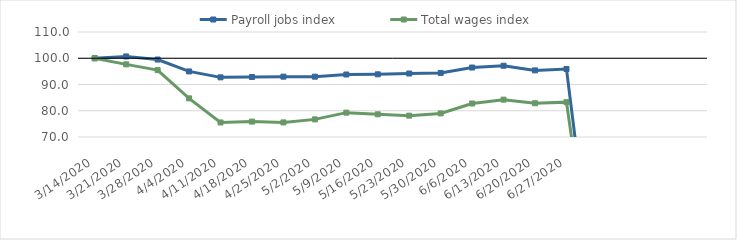
| Category | Payroll jobs index | Total wages index |
|---|---|---|
| 14/03/2020 | 100 | 100 |
| 21/03/2020 | 100.69 | 97.676 |
| 28/03/2020 | 99.508 | 95.471 |
| 04/04/2020 | 94.982 | 84.722 |
| 11/04/2020 | 92.724 | 75.542 |
| 18/04/2020 | 92.862 | 75.873 |
| 25/04/2020 | 92.989 | 75.556 |
| 02/05/2020 | 92.987 | 76.712 |
| 09/05/2020 | 93.813 | 79.275 |
| 16/05/2020 | 93.879 | 78.648 |
| 23/05/2020 | 94.183 | 78.135 |
| 30/05/2020 | 94.403 | 78.994 |
| 06/06/2020 | 96.462 | 82.763 |
| 13/06/2020 | 97.147 | 84.227 |
| 20/06/2020 | 95.377 | 82.865 |
| 27/06/2020 | 95.911 | 83.273 |